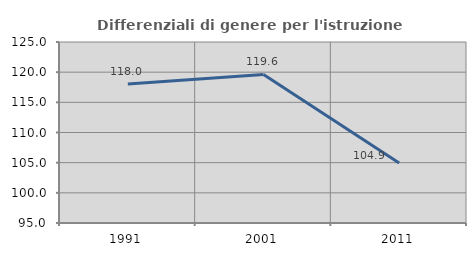
| Category | Differenziali di genere per l'istruzione superiore |
|---|---|
| 1991.0 | 118.029 |
| 2001.0 | 119.62 |
| 2011.0 | 104.948 |